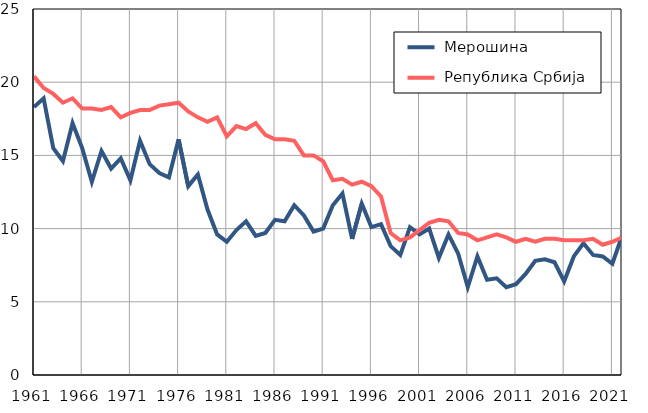
| Category |  Мерошина |  Република Србија |
|---|---|---|
| 1961.0 | 18.3 | 20.4 |
| 1962.0 | 18.9 | 19.6 |
| 1963.0 | 15.5 | 19.2 |
| 1964.0 | 14.6 | 18.6 |
| 1965.0 | 17.2 | 18.9 |
| 1966.0 | 15.5 | 18.2 |
| 1967.0 | 13.2 | 18.2 |
| 1968.0 | 15.3 | 18.1 |
| 1969.0 | 14.1 | 18.3 |
| 1970.0 | 14.8 | 17.6 |
| 1971.0 | 13.3 | 17.9 |
| 1972.0 | 16 | 18.1 |
| 1973.0 | 14.4 | 18.1 |
| 1974.0 | 13.8 | 18.4 |
| 1975.0 | 13.5 | 18.5 |
| 1976.0 | 16.1 | 18.6 |
| 1977.0 | 12.9 | 18 |
| 1978.0 | 13.7 | 17.6 |
| 1979.0 | 11.3 | 17.3 |
| 1980.0 | 9.6 | 17.6 |
| 1981.0 | 9.1 | 16.3 |
| 1982.0 | 9.9 | 17 |
| 1983.0 | 10.5 | 16.8 |
| 1984.0 | 9.5 | 17.2 |
| 1985.0 | 9.7 | 16.4 |
| 1986.0 | 10.6 | 16.1 |
| 1987.0 | 10.5 | 16.1 |
| 1988.0 | 11.6 | 16 |
| 1989.0 | 10.9 | 15 |
| 1990.0 | 9.8 | 15 |
| 1991.0 | 10 | 14.6 |
| 1992.0 | 11.6 | 13.3 |
| 1993.0 | 12.4 | 13.4 |
| 1994.0 | 9.3 | 13 |
| 1995.0 | 11.7 | 13.2 |
| 1996.0 | 10.1 | 12.9 |
| 1997.0 | 10.3 | 12.2 |
| 1998.0 | 8.8 | 9.7 |
| 1999.0 | 8.2 | 9.2 |
| 2000.0 | 10.1 | 9.4 |
| 2001.0 | 9.6 | 9.9 |
| 2002.0 | 10 | 10.4 |
| 2003.0 | 8 | 10.6 |
| 2004.0 | 9.6 | 10.5 |
| 2005.0 | 8.3 | 9.7 |
| 2006.0 | 6 | 9.6 |
| 2007.0 | 8.1 | 9.2 |
| 2008.0 | 6.5 | 9.4 |
| 2009.0 | 6.6 | 9.6 |
| 2010.0 | 6 | 9.4 |
| 2011.0 | 6.2 | 9.1 |
| 2012.0 | 6.9 | 9.3 |
| 2013.0 | 7.8 | 9.1 |
| 2014.0 | 7.9 | 9.3 |
| 2015.0 | 7.7 | 9.3 |
| 2016.0 | 6.4 | 9.2 |
| 2017.0 | 8.1 | 9.2 |
| 2018.0 | 9 | 9.2 |
| 2019.0 | 8.2 | 9.3 |
| 2020.0 | 8.1 | 8.9 |
| 2021.0 | 7.6 | 9.1 |
| 2022.0 | 9.5 | 9.4 |